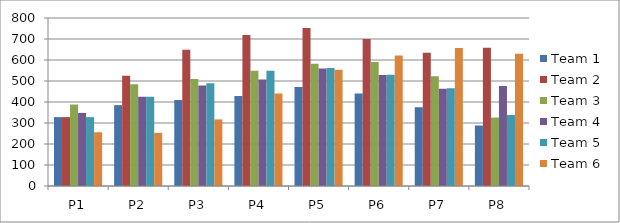
| Category | Team 1 | Team 2 | Team 3 | Team 4 | Team 5 | Team 6 |
|---|---|---|---|---|---|---|
| P1 | 328 | 328 | 388 | 348 | 328 | 256 |
| P2 | 385 | 525 | 485 | 425 | 425 | 253 |
| P3 | 409 | 649 | 509 | 479 | 489 | 317 |
| P4 | 429 | 719 | 549 | 507 | 549 | 441 |
| P5 | 472 | 752 | 582 | 560 | 562 | 554 |
| P6 | 440 | 700 | 590 | 528 | 530 | 622 |
| P7 | 375 | 635 | 523 | 463 | 465 | 657 |
| P8 | 288 | 658 | 326 | 476 | 338 | 630 |